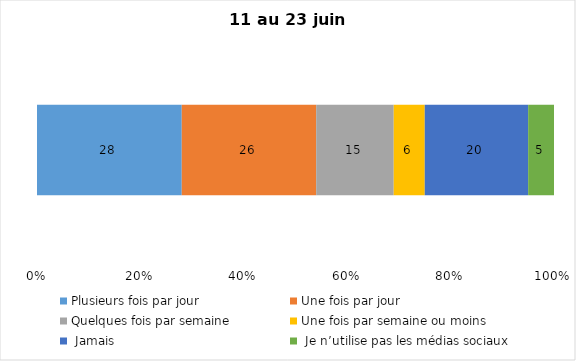
| Category | Plusieurs fois par jour | Une fois par jour | Quelques fois par semaine   | Une fois par semaine ou moins   |  Jamais   |  Je n’utilise pas les médias sociaux |
|---|---|---|---|---|---|---|
| 0 | 28 | 26 | 15 | 6 | 20 | 5 |